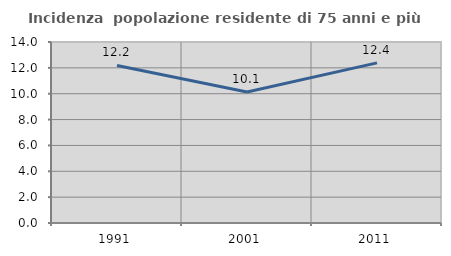
| Category | Incidenza  popolazione residente di 75 anni e più |
|---|---|
| 1991.0 | 12.183 |
| 2001.0 | 10.135 |
| 2011.0 | 12.388 |